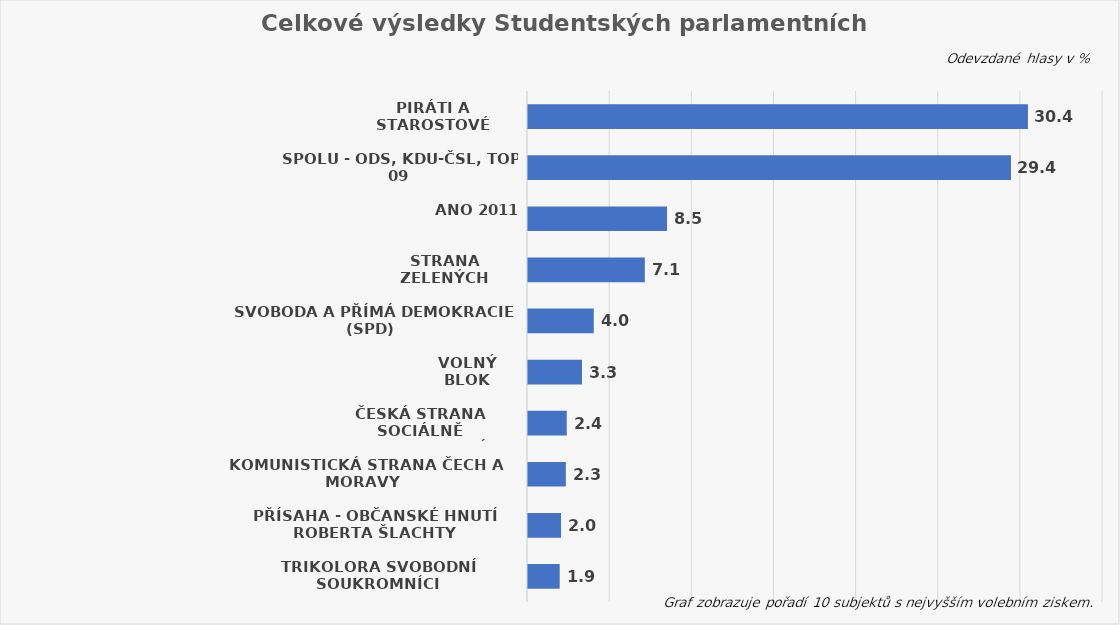
| Category | Series 0 |
|---|---|
| PIRÁTI a STAROSTOVÉ | 30.431 |
| SPOLU - ODS, KDU-ČSL, TOP 09 | 29.399 |
| ANO 2011 | 8.462 |
| Strana zelených | 7.11 |
| Svoboda a přímá demokracie (SPD) | 4.003 |
| VOLNÝ blok | 3.286 |
| Česká strana sociálně demokratická | 2.359 |
| Komunistická strana Čech a Moravy | 2.303 |
| PŘÍSAHA - občanské hnutí Roberta Šlachty | 2.012 |
| Trikolora Svobodní Soukromníci | 1.929 |